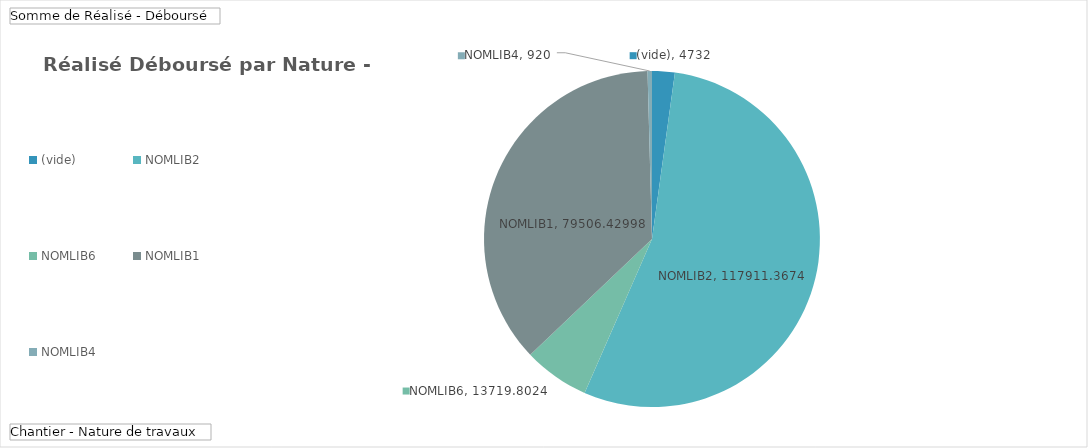
| Category | Total |
|---|---|
| (vide) | 4732 |
| NOMLIB2 | 117911.367 |
| NOMLIB6 | 13719.802 |
| NOMLIB1 | 79506.43 |
| NOMLIB4 | 920 |